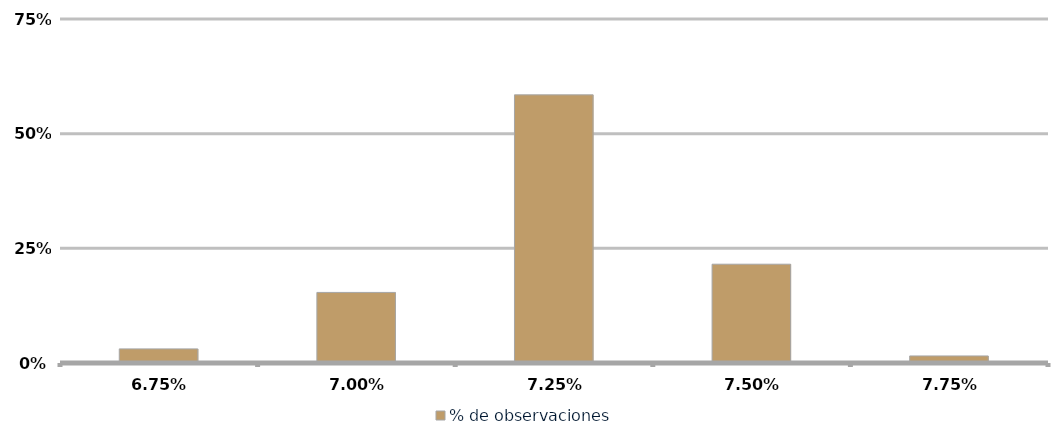
| Category | % de observaciones  |
|---|---|
| 0.06749999999999999 | 0.031 |
| 0.06999999999999999 | 0.154 |
| 0.0725 | 0.585 |
| 0.075 | 0.215 |
| 0.0775 | 0.015 |